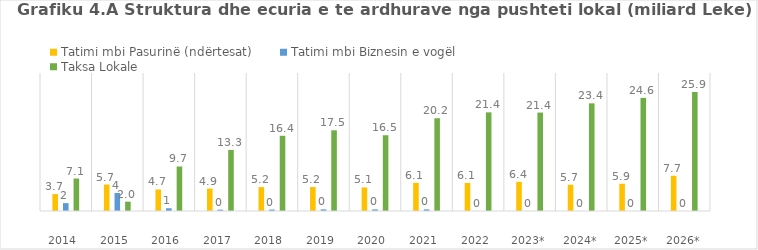
| Category | Tatimi mbi Pasurinë (ndërtesat) | Tatimi mbi Biznesin e vogël | Taksa Lokale |
|---|---|---|---|
| 2014  | 3.678 | 1.709 | 7.06 |
| 2015  | 5.746 | 3.921 | 2.033 |
| 2016  | 4.678 | 0.598 | 9.675 |
| 2017  | 4.879 | 0.296 | 13.273 |
| 2018  | 5.192 | 0.316 | 16.354 |
| 2019  | 5.208 | 0.355 | 17.539 |
| 2020  | 5.124 | 0.355 | 16.468 |
| 2021  | 6.116 | 0.355 | 20.166 |
| 2022  | 6.1 | 0 | 21.445 |
| 2023* | 6.35 | 0 | 21.4 |
| 2024* | 5.71 | 0 | 23.4 |
| 2025* | 5.93 | 0 | 24.6 |
| 2026* | 7.66 | 0 | 25.87 |